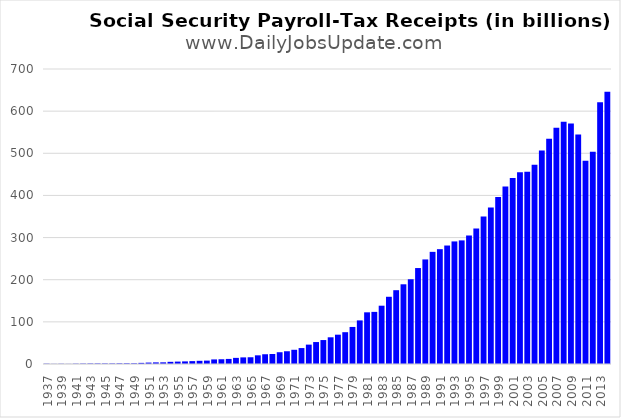
| Category | Net |
|---|---|
| 1937.0 | 765 |
| 1938.0 | 360 |
| 1939.0 | 580 |
| 1940.0 | 325 |
| 1941.0 | 789 |
| 1942.0 | 1012 |
| 1943.0 | 1239 |
| 1944.0 | 1316 |
| 1945.0 | 1285 |
| 1946.0 | 1295 |
| 1947.0 | 1557 |
| 1948.0 | 1685 |
| 1949.0 | 1666 |
| 1950.0 | 2667 |
| 1951.0 | 3363 |
| 1952.0 | 3819 |
| 1953.0 | 3945 |
| 1954.0 | 5163 |
| 1955.0 | 5713 |
| 1956.0 | 6172 |
| 1957.0 | 6825 |
| 1958.0 | 7566 |
| 1959.0 | 8052 |
| 1960.0 | 10866 |
| 1961.0 | 11285 |
| 1962.0 | 12059 |
| 1963.0 | 14541 |
| 1964.0 | 15689 |
| 1965.0 | 16017 |
| 1966.0 | 20580 |
| 1967.0 | 23138 |
| 1968.0 | 23719 |
| 1969.0 | 27947 |
| 1970.0 | 30256 |
| 1971.0 | 33723 |
| 1972.0 | 37781 |
| 1973.0 | 45975 |
| 1974.0 | 52081 |
| 1975.0 | 56816 |
| 1976.0 | 63362 |
| 1977.0 | 69572 |
| 1978.0 | 75471 |
| 1979.0 | 87919 |
| 1980.0 | 103456 |
| 1981.0 | 122627 |
| 1982.0 | 123673 |
| 1983.0 | 138337 |
| 1984.0 | 159515 |
| 1985.0 | 175128 |
| 1986.0 | 189136 |
| 1987.0 | 201092 |
| 1988.0 | 227683 |
| 1989.0 | 248128 |
| 1990.0 | 266110 |
| 1991.0 | 272477 |
| 1992.0 | 281132 |
| 1993.0 | 290865 |
| 1994.0 | 293316 |
| 1995.0 | 304659 |
| 1996.0 | 321555 |
| 1997.0 | 349945 |
| 1998.0 | 371206 |
| 1999.0 | 396352 |
| 2000.0 | 421390 |
| 2001.0 | 441458 |
| 2002.0 | 455198 |
| 2003.0 | 456077 |
| 2004.0 | 472758 |
| 2005.0 | 506862 |
| 2006.0 | 534786 |
| 2007.0 | 560877 |
| 2008.0 | 574555 |
| 2009.0 | 570392 |
| 2010.0 | 544773 |
| 2011.0 | 482350 |
| 2012.0 | 503893 |
| 2013.0 | 620814 |
| 2014.0 | 646232 |